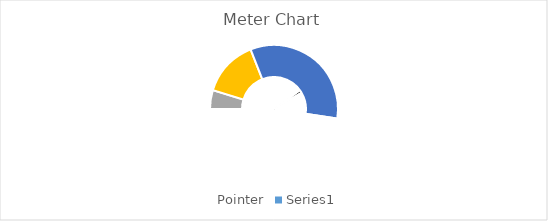
| Category | Pointer |
|---|---|
| 0 | 80 |
| 1 | 3 |
| 2 | 117 |